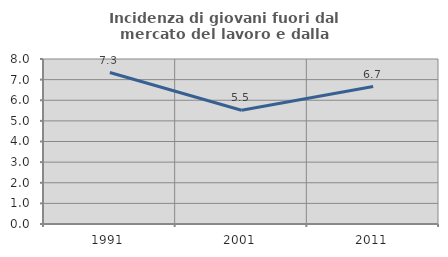
| Category | Incidenza di giovani fuori dal mercato del lavoro e dalla formazione  |
|---|---|
| 1991.0 | 7.345 |
| 2001.0 | 5.517 |
| 2011.0 | 6.667 |